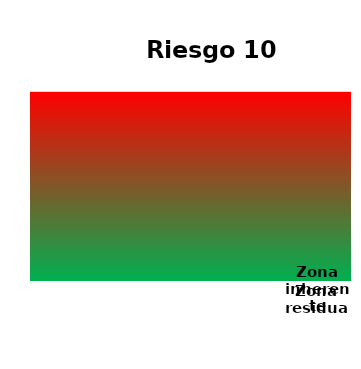
| Category | Zona  | Zona Residual | Zona inherente |
|---|---|---|---|
| Riesgo 10 | 4 | 0 | 0 |